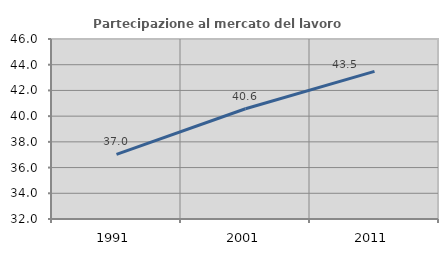
| Category | Partecipazione al mercato del lavoro  femminile |
|---|---|
| 1991.0 | 37.031 |
| 2001.0 | 40.577 |
| 2011.0 | 43.478 |